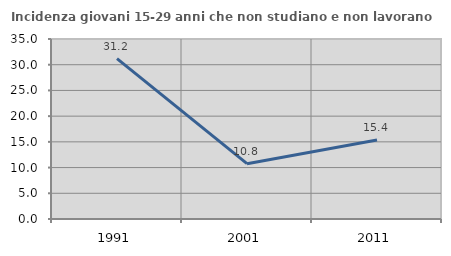
| Category | Incidenza giovani 15-29 anni che non studiano e non lavorano  |
|---|---|
| 1991.0 | 31.18 |
| 2001.0 | 10.751 |
| 2011.0 | 15.361 |